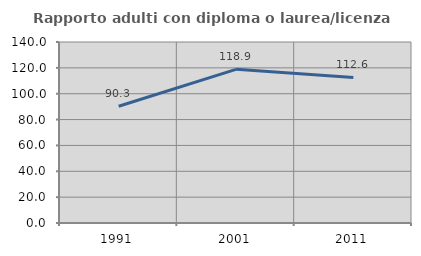
| Category | Rapporto adulti con diploma o laurea/licenza media  |
|---|---|
| 1991.0 | 90.336 |
| 2001.0 | 118.876 |
| 2011.0 | 112.581 |